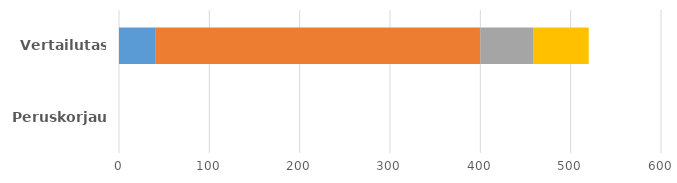
| Category | Aluerakenteet | Talo-osat | Tila-osat | Talotekniikka |
|---|---|---|---|---|
| Peruskorjaus | 0 | 0 | 0 | 0 |
| Vertailutaso | 40 | 360 | 59 | 61 |